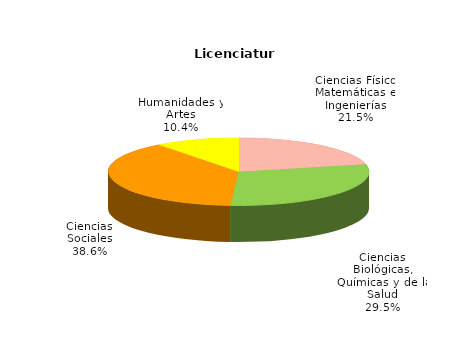
| Category | Series 0 |
|---|---|
| Ciencias Físico Matemáticas e Ingenierías | 43827 |
| Ciencias Biológicas, Químicas y de la Salud | 60267 |
| Ciencias Sociales | 78879 |
| Humanidades y Artes | 21218 |